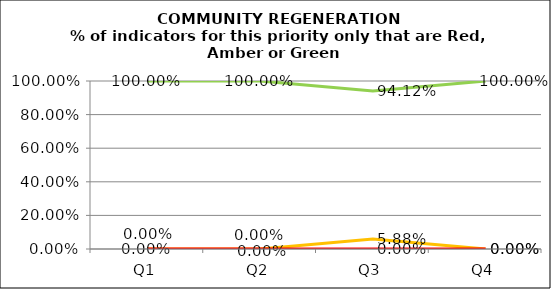
| Category | Green | Amber | Red |
|---|---|---|---|
| Q1 | 1 | 0 | 0 |
| Q2 | 1 | 0 | 0 |
| Q3 | 0.941 | 0.059 | 0 |
| Q4 | 1 | 0 | 0 |